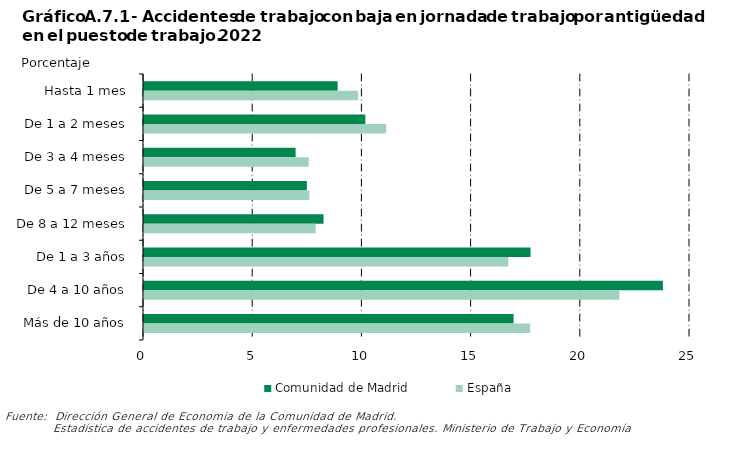
| Category | Comunidad de Madrid | España |
|---|---|---|
| 0 | 8.867 | 9.801 |
| 1 | 10.133 | 11.09 |
| 2 | 6.942 | 7.544 |
| 3 | 7.457 | 7.571 |
| 4 | 8.221 | 7.86 |
| 5 | 17.699 | 16.681 |
| 6 | 23.759 | 21.769 |
| 7 | 16.923 | 17.684 |